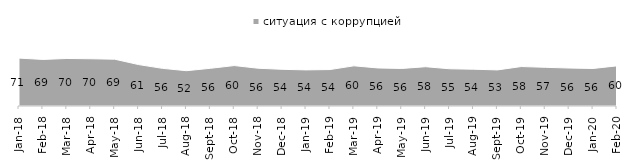
| Category | ситуация с коррупцией |
|---|---|
| 2018-01-01 | 70.95 |
| 2018-02-01 | 69 |
| 2018-03-01 | 70.4 |
| 2018-04-01 | 70 |
| 2018-05-01 | 69.35 |
| 2018-06-01 | 61.35 |
| 2018-07-01 | 55.75 |
| 2018-08-01 | 52.3 |
| 2018-09-01 | 55.85 |
| 2018-10-01 | 59.9 |
| 2018-11-01 | 55.938 |
| 2018-12-01 | 54.35 |
| 2019-01-01 | 53.5 |
| 2019-02-01 | 54 |
| 2019-03-01 | 59.523 |
| 2019-04-01 | 56.386 |
| 2019-05-01 | 55.622 |
| 2019-06-01 | 58.204 |
| 2019-07-01 | 55.149 |
| 2019-08-01 | 54.496 |
| 2019-09-01 | 53.465 |
| 2019-10-01 | 58.465 |
| 2019-11-01 | 57.327 |
| 2019-12-01 | 56.238 |
| 2020-01-01 | 55.594 |
| 2020-02-01 | 59.505 |